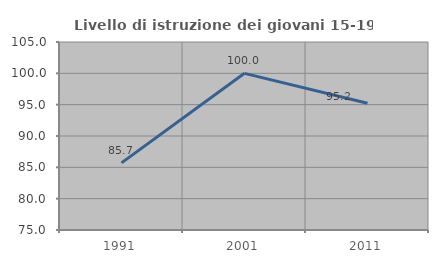
| Category | Livello di istruzione dei giovani 15-19 anni |
|---|---|
| 1991.0 | 85.714 |
| 2001.0 | 100 |
| 2011.0 | 95.238 |